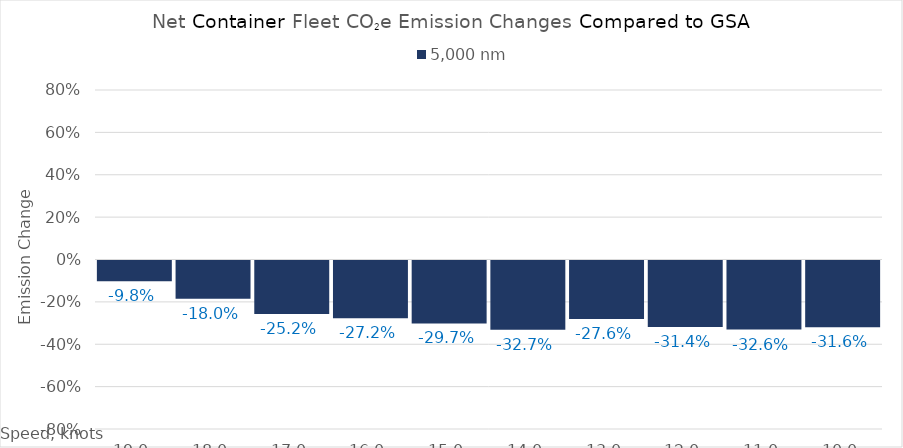
| Category | 5,000 |
|---|---|
| 19.0 | -0.098 |
| 18.0 | -0.18 |
| 17.0 | -0.252 |
| 16.0 | -0.272 |
| 15.0 | -0.297 |
| 14.0 | -0.327 |
| 13.0 | -0.276 |
| 12.0 | -0.314 |
| 11.0 | -0.326 |
| 10.0 | -0.316 |